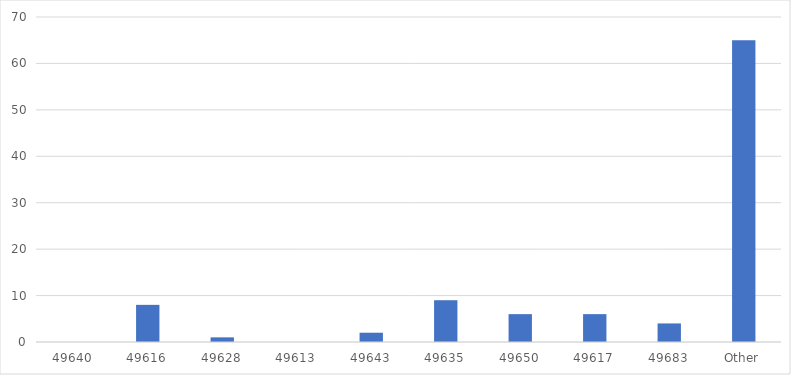
| Category | Number of Responses |
|---|---|
| 49640 | 0 |
| 49616 | 8 |
| 49628 | 1 |
| 49613 | 0 |
| 49643 | 2 |
| 49635 | 9 |
| 49650 | 6 |
| 49617 | 6 |
| 49683 | 4 |
| Other | 65 |